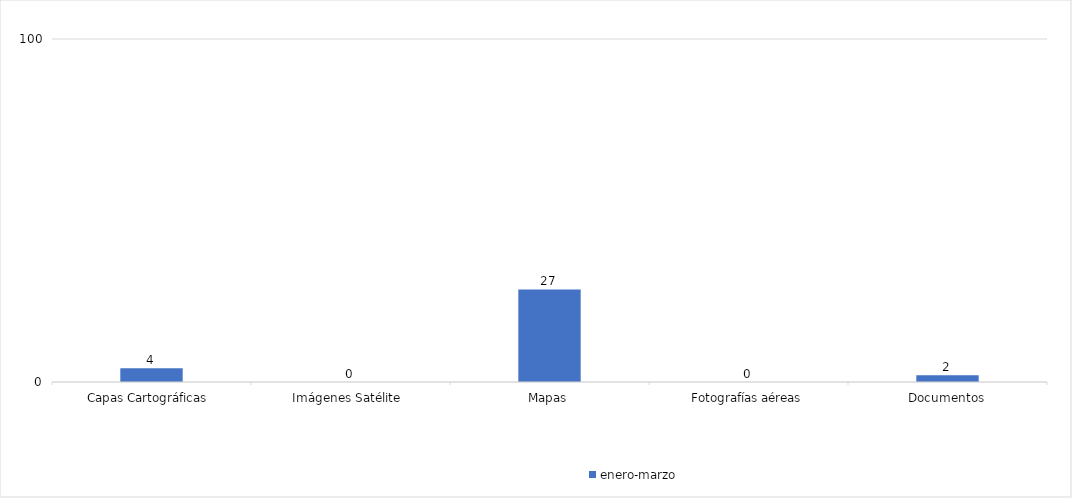
| Category | enero-marzo | Series 1 | Series 2 | Series 3 |
|---|---|---|---|---|
| Capas Cartográficas  | 4 |  |  |  |
| Imágenes Satélite  | 0 |  |  |  |
| Mapas | 27 |  |  |  |
| Fotografías aéreas | 0 |  |  |  |
| Documentos | 2 |  |  |  |